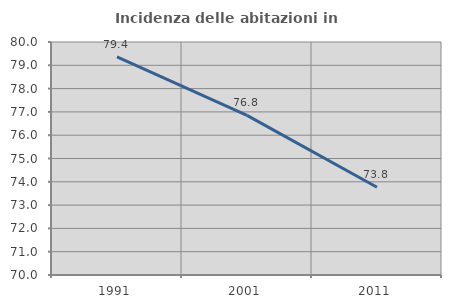
| Category | Incidenza delle abitazioni in proprietà  |
|---|---|
| 1991.0 | 79.366 |
| 2001.0 | 76.85 |
| 2011.0 | 73.766 |